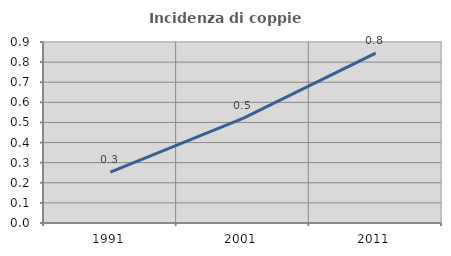
| Category | Incidenza di coppie miste |
|---|---|
| 1991.0 | 0.253 |
| 2001.0 | 0.52 |
| 2011.0 | 0.845 |